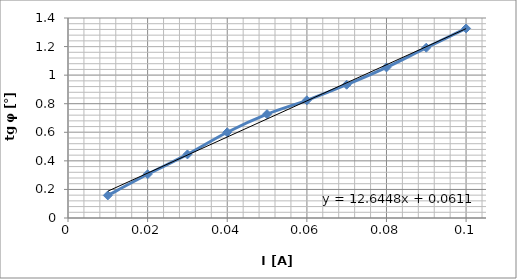
| Category | Series 0 |
|---|---|
| 0.01 | 0.158 |
| 0.02 | 0.306 |
| 0.03 | 0.445 |
| 0.04 | 0.6 |
| 0.05 | 0.727 |
| 0.06 | 0.824 |
| 0.07 | 0.933 |
| 0.08 | 1.054 |
| 0.09 | 1.192 |
| 0.1 | 1.327 |